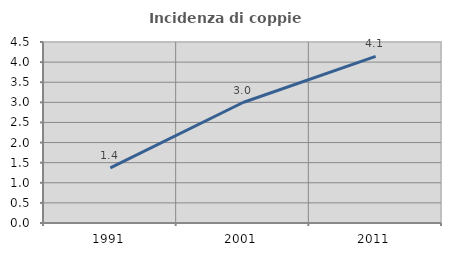
| Category | Incidenza di coppie miste |
|---|---|
| 1991.0 | 1.369 |
| 2001.0 | 2.996 |
| 2011.0 | 4.142 |